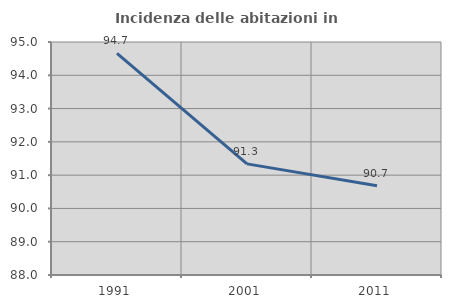
| Category | Incidenza delle abitazioni in proprietà  |
|---|---|
| 1991.0 | 94.656 |
| 2001.0 | 91.339 |
| 2011.0 | 90.681 |